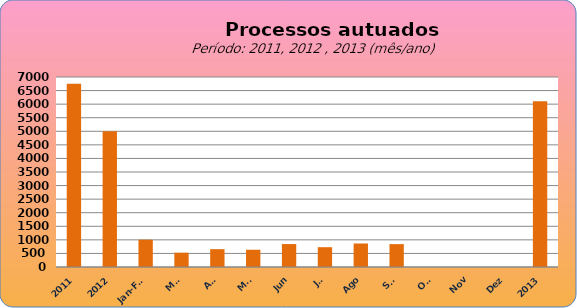
| Category | 6749 4998 1006 527 657 636 845 730 866 843 0 0 0 |
|---|---|
| 2011 | 6749 |
| 2012 | 4998 |
| Jan-Fev | 1006 |
| Mar | 527 |
| Abr | 657 |
| Mai | 636 |
| Jun | 845 |
| Jul | 730 |
| Ago | 866 |
| Set | 843 |
| Out | 0 |
| Nov | 0 |
| Dez | 0 |
| 2013 | 6110 |